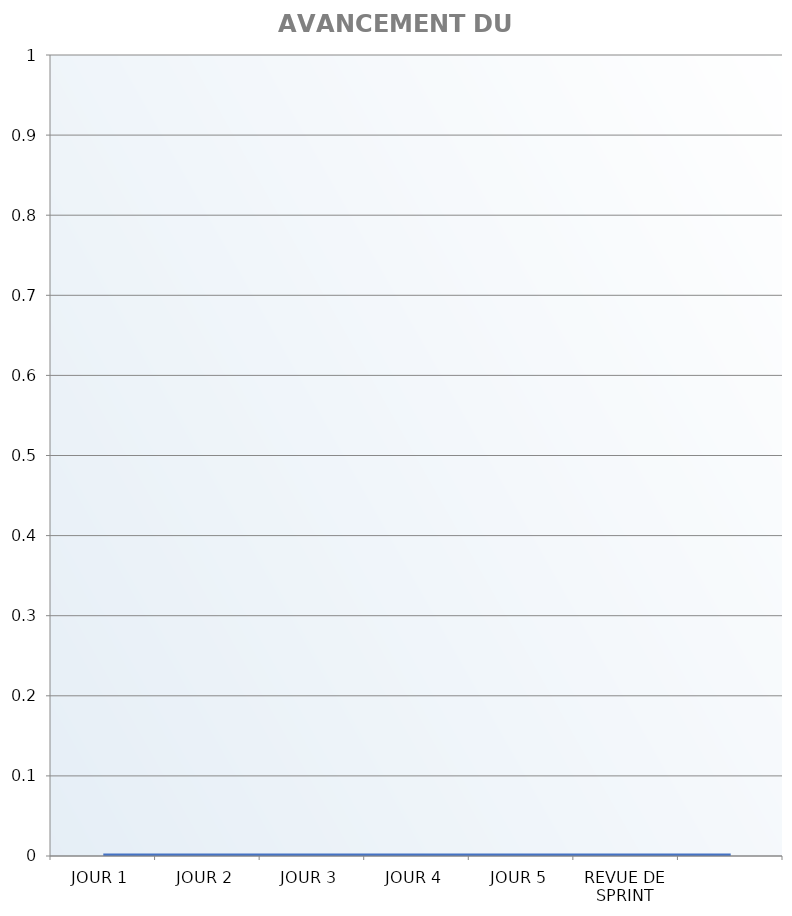
| Category | DIAGRAMME D’AVANCEMENT DU SPRINT |
|---|---|
| JOUR 1 | 0 |
| JOUR 2 | 0 |
| JOUR 3 | 0 |
| JOUR 4 | 0 |
| JOUR 5 | 0 |
| REVUE DE SPRINT | 0 |